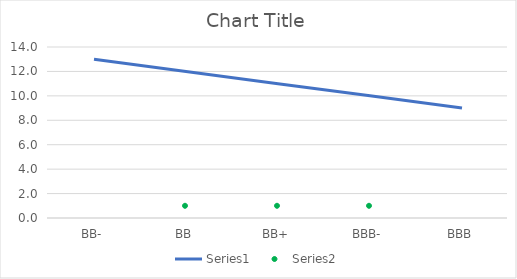
| Category | Series 0 |
|---|---|
| BB- | 13 |
| BB | 12 |
| BB+ | 11 |
| BBB- | 10 |
| BBB | 9 |